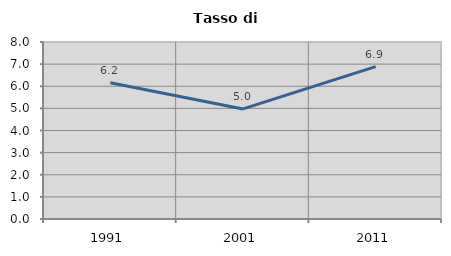
| Category | Tasso di disoccupazione   |
|---|---|
| 1991.0 | 6.162 |
| 2001.0 | 4.975 |
| 2011.0 | 6.889 |